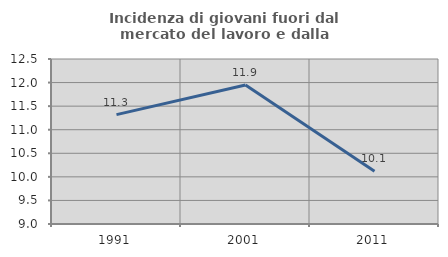
| Category | Incidenza di giovani fuori dal mercato del lavoro e dalla formazione  |
|---|---|
| 1991.0 | 11.321 |
| 2001.0 | 11.947 |
| 2011.0 | 10.119 |